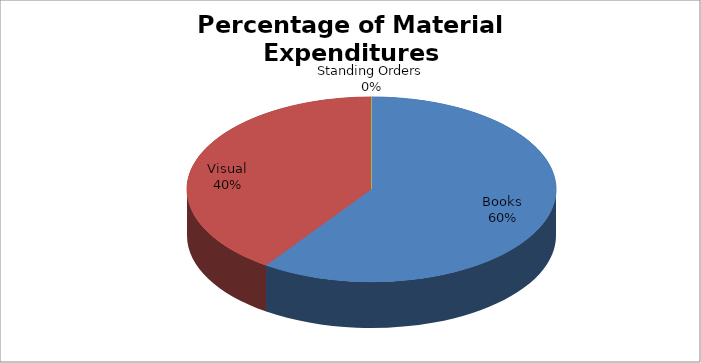
| Category | Series 0 |
|---|---|
| Books | 7178.96 |
| Visual | 4854.24 |
| Standing Orders | 0 |